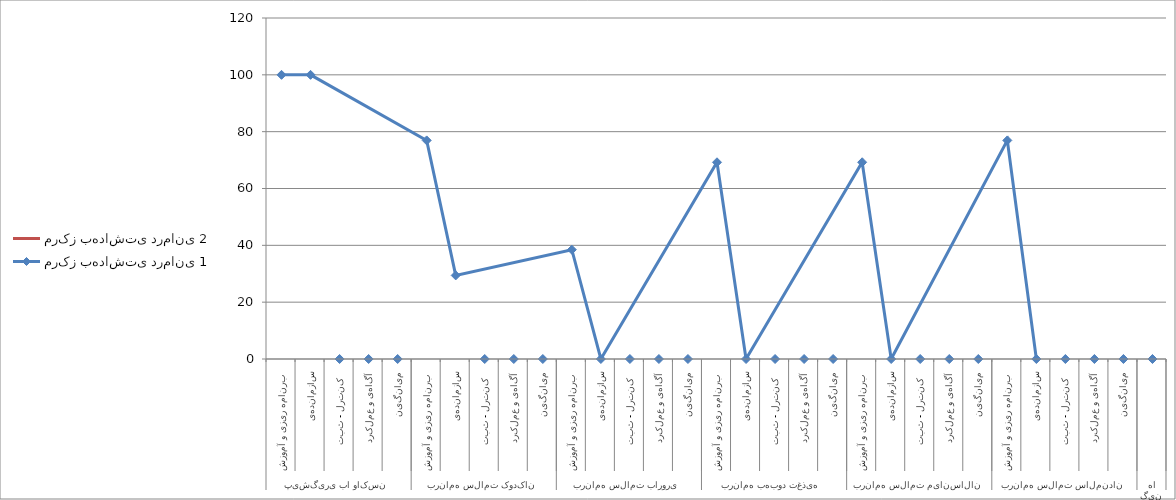
| Category | مرکز بهداشتی درمانی 1 | مرکز بهداشتی درمانی 2 |
|---|---|---|
| 0 | 100 | 0 |
| 1 | 100 | 0 |
| 2 | 0 | 0 |
| 3 | 0 | 0 |
| 4 | 0 | 0 |
| 5 | 76.923 | 0 |
| 6 | 29.412 | 0 |
| 7 | 0 | 0 |
| 8 | 0 | 0 |
| 9 | 0 | 0 |
| 10 | 38.462 | 0 |
| 11 | 0 | 0 |
| 12 | 0 | 0 |
| 13 | 0 | 0 |
| 14 | 0 | 0 |
| 15 | 69.231 | 0 |
| 16 | 0 | 0 |
| 17 | 0 | 0 |
| 18 | 0 | 0 |
| 19 | 0 | 0 |
| 20 | 69.231 | 0 |
| 21 | 0 | 0 |
| 22 | 0 | 0 |
| 23 | 0 | 0 |
| 24 | 0 | 0 |
| 25 | 76.923 | 0 |
| 26 | 0 | 0 |
| 27 | 0 | 0 |
| 28 | 0 | 0 |
| 29 | 0 | 0 |
| 30 | 0 | 0 |